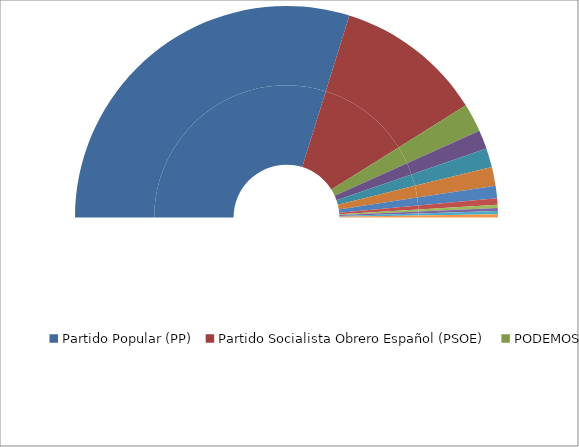
| Category | Series 0 | Series 1 |
|---|---|---|
| Partido Popular (PP) | 124 | 59.615 |
| Partido Socialista Obrero Español (PSOE) | 47 | 22.596 |
| PODEMOS | 9 | 4.327 |
| Esquerra Republicana De Catalunya-Catalunya Sí (ERC-CATSI) | 6 | 2.885 |
| Democràcia I Llibertat. Convergència. Demòcrates (DL) | 6 | 2.885 |
| Euzko Alderdi Jeltzalea-Partido Nacionalista Vasco (EAJ-PNV) | 6 | 2.885 |
| "En Comú Podem" (EN COMÚ) | 4 | 1.923 |
| En Marea (PODEMOS-En) | 2 | 0.962 |
| Compromís-Podemos-És El Moment (PODEMOS-COM) | 1 | 0.481 |
| Cambio-Aldaketa (CAMBIO-ALDA) | 1 | 0.481 |
| Coalición Canaria - Partido Nacionalista Canario (CCa-PNC) | 1 | 0.481 |
| Agrupación Socialista Gomera (ASG) | 1 | 0.481 |